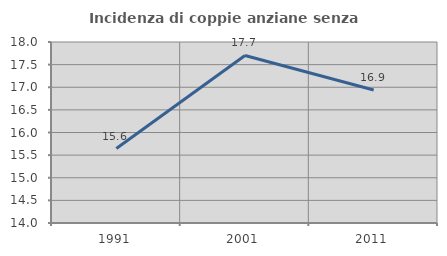
| Category | Incidenza di coppie anziane senza figli  |
|---|---|
| 1991.0 | 15.646 |
| 2001.0 | 17.702 |
| 2011.0 | 16.94 |